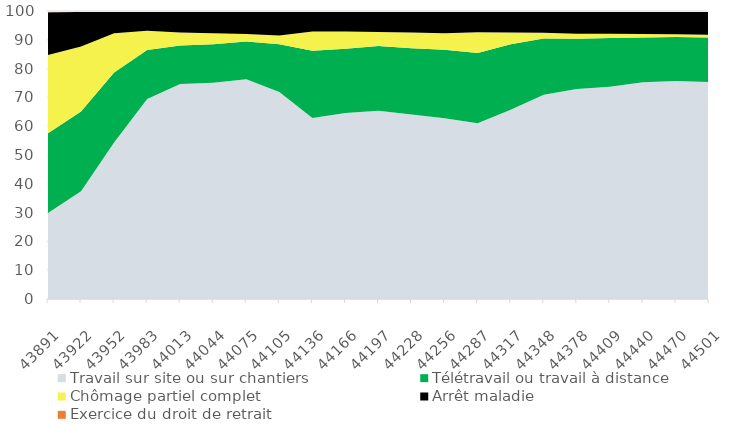
| Category | Travail sur site ou sur chantiers | Télétravail ou travail à distance | Chômage partiel complet | Arrêt maladie | Exercice du droit de retrait |
|---|---|---|---|---|---|
| 43891.0 | 29.825 | 27.741 | 27.193 | 14.803 | 0.439 |
| 43922.0 | 37.416 | 27.728 | 22.494 | 12.027 | 0.334 |
| 43952.0 | 54.338 | 24.295 | 13.666 | 7.484 | 0.217 |
| 43983.0 | 69.453 | 17.042 | 6.645 | 6.645 | 0.214 |
| 44013.0 | 74.682 | 13.359 | 4.453 | 7.252 | 0.254 |
| 44044.0 | 75.068 | 13.415 | 3.794 | 7.453 | 0.271 |
| 44075.0 | 76.293 | 13.147 | 2.586 | 7.866 | 0.108 |
| 44105.0 | 71.916 | 16.52 | 3.084 | 8.37 | 0.11 |
| 44136.0 | 62.83 | 23.337 | 6.758 | 6.969 | 0.106 |
| 44166.0 | 64.625 | 22.25 | 6 | 7 | 0.125 |
| 44197.0 | 65.36 | 22.458 | 4.873 | 7.203 | 0.106 |
| 44228.0 | 64.08 | 22.949 | 5.543 | 7.317 | 0.111 |
| 44256.0 | 62.781 | 23.743 | 5.775 | 7.594 | 0.107 |
| 44287.0 | 61.062 | 24.336 | 7.19 | 7.301 | 0.111 |
| 44317.0 | 65.705 | 22.752 | 4.107 | 7.325 | 0.111 |
| 44348.0 | 70.905 | 19.504 | 2.047 | 7.435 | 0.108 |
| 44378.0 | 72.896 | 17.45 | 1.733 | 7.673 | 0.248 |
| 44409.0 | 73.656 | 16.935 | 1.478 | 7.661 | 0.269 |
| 44440.0 | 75.298 | 15.493 | 1.192 | 7.909 | 0.108 |
| 44470.0 | 75.691 | 15.249 | 0.994 | 7.956 | 0.11 |
| 44501.0 | 75.375 | 15.418 | 0.964 | 8.137 | 0.107 |